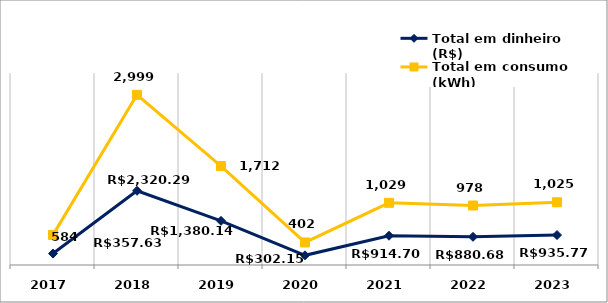
| Category | Total em dinheiro (R$) | Total em consumo (kWh) |
|---|---|---|
| 2017.0 | 357.63 | 584 |
| 2018.0 | 2320.29 | 2999 |
| 2019.0 | 1380.14 | 1712 |
| 2020.0 | 302.15 | 402 |
| 2021.0 | 914.7 | 1029 |
| 2022.0 | 880.68 | 978 |
| 2023.0 | 935.77 | 1025 |